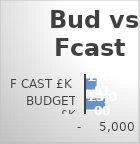
| Category | Series 0 |
|---|---|
| Budget £k | 3000 |
| F cast £k | 1680.79 |